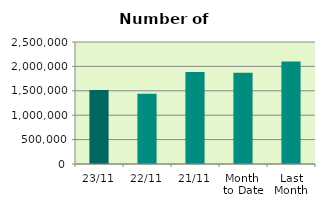
| Category | Series 0 |
|---|---|
| 23/11 | 1516492 |
| 22/11 | 1439378 |
| 21/11 | 1886922 |
| Month 
to Date | 1869435.882 |
| Last
Month | 2101052.87 |